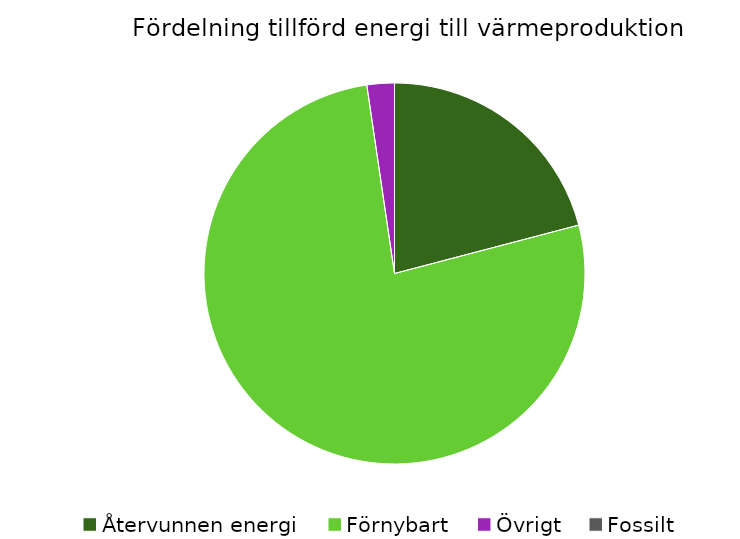
| Category | Fördelning värmeproduktion |
|---|---|
| Återvunnen energi | 0 |
| Förnybart | 0 |
| Övrigt | 0 |
| Fossilt | 0 |